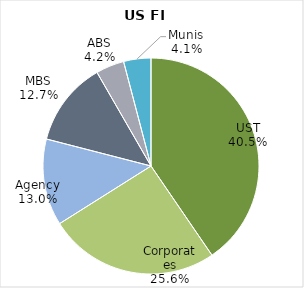
| Category | Fixed Income Issuance Breakout |
|---|---|
| UST | 0.405 |
| Corporates | 0.256 |
| Agency | 0.13 |
| MBS | 0.127 |
| ABS | 0.042 |
| Munis | 0.041 |